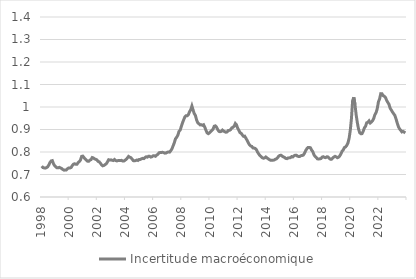
| Category | Incertitude macroéconomique |
|---|---|
| 1998-02-01 | 0.737 |
| 1998-03-01 | 0.731 |
| 1998-04-01 | 0.729 |
| 1998-05-01 | 0.728 |
| 1998-06-01 | 0.73 |
| 1998-07-01 | 0.734 |
| 1998-08-01 | 0.742 |
| 1998-09-01 | 0.753 |
| 1998-10-01 | 0.76 |
| 1998-11-01 | 0.762 |
| 1998-12-01 | 0.747 |
| 1999-01-01 | 0.739 |
| 1999-02-01 | 0.734 |
| 1999-03-01 | 0.73 |
| 1999-04-01 | 0.73 |
| 1999-05-01 | 0.732 |
| 1999-06-01 | 0.729 |
| 1999-07-01 | 0.726 |
| 1999-08-01 | 0.722 |
| 1999-09-01 | 0.719 |
| 1999-10-01 | 0.72 |
| 1999-11-01 | 0.72 |
| 1999-12-01 | 0.726 |
| 2000-01-01 | 0.729 |
| 2000-02-01 | 0.729 |
| 2000-03-01 | 0.731 |
| 2000-04-01 | 0.739 |
| 2000-05-01 | 0.746 |
| 2000-06-01 | 0.748 |
| 2000-07-01 | 0.746 |
| 2000-08-01 | 0.745 |
| 2000-09-01 | 0.753 |
| 2000-10-01 | 0.757 |
| 2000-11-01 | 0.764 |
| 2000-12-01 | 0.78 |
| 2001-01-01 | 0.782 |
| 2001-02-01 | 0.775 |
| 2001-03-01 | 0.769 |
| 2001-04-01 | 0.764 |
| 2001-05-01 | 0.759 |
| 2001-06-01 | 0.759 |
| 2001-07-01 | 0.764 |
| 2001-08-01 | 0.766 |
| 2001-09-01 | 0.775 |
| 2001-10-01 | 0.773 |
| 2001-11-01 | 0.769 |
| 2001-12-01 | 0.768 |
| 2002-01-01 | 0.765 |
| 2002-02-01 | 0.759 |
| 2002-03-01 | 0.756 |
| 2002-04-01 | 0.75 |
| 2002-05-01 | 0.742 |
| 2002-06-01 | 0.739 |
| 2002-07-01 | 0.74 |
| 2002-08-01 | 0.744 |
| 2002-09-01 | 0.748 |
| 2002-10-01 | 0.756 |
| 2002-11-01 | 0.766 |
| 2002-12-01 | 0.764 |
| 2003-01-01 | 0.765 |
| 2003-02-01 | 0.763 |
| 2003-03-01 | 0.762 |
| 2003-04-01 | 0.767 |
| 2003-05-01 | 0.762 |
| 2003-06-01 | 0.76 |
| 2003-07-01 | 0.762 |
| 2003-08-01 | 0.762 |
| 2003-09-01 | 0.762 |
| 2003-10-01 | 0.763 |
| 2003-11-01 | 0.76 |
| 2003-12-01 | 0.76 |
| 2004-01-01 | 0.763 |
| 2004-02-01 | 0.768 |
| 2004-03-01 | 0.774 |
| 2004-04-01 | 0.78 |
| 2004-05-01 | 0.777 |
| 2004-06-01 | 0.775 |
| 2004-07-01 | 0.769 |
| 2004-08-01 | 0.762 |
| 2004-09-01 | 0.761 |
| 2004-10-01 | 0.762 |
| 2004-11-01 | 0.764 |
| 2004-12-01 | 0.762 |
| 2005-01-01 | 0.767 |
| 2005-02-01 | 0.767 |
| 2005-03-01 | 0.77 |
| 2005-04-01 | 0.772 |
| 2005-05-01 | 0.771 |
| 2005-06-01 | 0.775 |
| 2005-07-01 | 0.779 |
| 2005-08-01 | 0.777 |
| 2005-09-01 | 0.781 |
| 2005-10-01 | 0.781 |
| 2005-11-01 | 0.777 |
| 2005-12-01 | 0.779 |
| 2006-01-01 | 0.783 |
| 2006-02-01 | 0.783 |
| 2006-03-01 | 0.781 |
| 2006-04-01 | 0.786 |
| 2006-05-01 | 0.79 |
| 2006-06-01 | 0.796 |
| 2006-07-01 | 0.798 |
| 2006-08-01 | 0.798 |
| 2006-09-01 | 0.799 |
| 2006-10-01 | 0.797 |
| 2006-11-01 | 0.795 |
| 2006-12-01 | 0.796 |
| 2007-01-01 | 0.799 |
| 2007-02-01 | 0.8 |
| 2007-03-01 | 0.799 |
| 2007-04-01 | 0.806 |
| 2007-05-01 | 0.814 |
| 2007-06-01 | 0.828 |
| 2007-07-01 | 0.841 |
| 2007-08-01 | 0.859 |
| 2007-09-01 | 0.865 |
| 2007-10-01 | 0.875 |
| 2007-11-01 | 0.892 |
| 2007-12-01 | 0.897 |
| 2008-01-01 | 0.914 |
| 2008-02-01 | 0.93 |
| 2008-03-01 | 0.943 |
| 2008-04-01 | 0.956 |
| 2008-05-01 | 0.961 |
| 2008-06-01 | 0.961 |
| 2008-07-01 | 0.966 |
| 2008-08-01 | 0.979 |
| 2008-09-01 | 0.988 |
| 2008-10-01 | 1.004 |
| 2008-11-01 | 0.987 |
| 2008-12-01 | 0.971 |
| 2009-01-01 | 0.962 |
| 2009-02-01 | 0.942 |
| 2009-03-01 | 0.93 |
| 2009-04-01 | 0.925 |
| 2009-05-01 | 0.92 |
| 2009-06-01 | 0.921 |
| 2009-07-01 | 0.918 |
| 2009-08-01 | 0.921 |
| 2009-09-01 | 0.91 |
| 2009-10-01 | 0.896 |
| 2009-11-01 | 0.885 |
| 2009-12-01 | 0.882 |
| 2010-01-01 | 0.885 |
| 2010-02-01 | 0.891 |
| 2010-03-01 | 0.896 |
| 2010-04-01 | 0.902 |
| 2010-05-01 | 0.914 |
| 2010-06-01 | 0.916 |
| 2010-07-01 | 0.911 |
| 2010-08-01 | 0.9 |
| 2010-09-01 | 0.892 |
| 2010-10-01 | 0.89 |
| 2010-11-01 | 0.892 |
| 2010-12-01 | 0.897 |
| 2011-01-01 | 0.893 |
| 2011-02-01 | 0.89 |
| 2011-03-01 | 0.888 |
| 2011-04-01 | 0.889 |
| 2011-05-01 | 0.896 |
| 2011-06-01 | 0.896 |
| 2011-07-01 | 0.9 |
| 2011-08-01 | 0.907 |
| 2011-09-01 | 0.91 |
| 2011-10-01 | 0.914 |
| 2011-11-01 | 0.927 |
| 2011-12-01 | 0.921 |
| 2012-01-01 | 0.906 |
| 2012-02-01 | 0.896 |
| 2012-03-01 | 0.886 |
| 2012-04-01 | 0.883 |
| 2012-05-01 | 0.876 |
| 2012-06-01 | 0.87 |
| 2012-07-01 | 0.87 |
| 2012-08-01 | 0.861 |
| 2012-09-01 | 0.852 |
| 2012-10-01 | 0.842 |
| 2012-11-01 | 0.832 |
| 2012-12-01 | 0.827 |
| 2013-01-01 | 0.825 |
| 2013-02-01 | 0.818 |
| 2013-03-01 | 0.817 |
| 2013-04-01 | 0.816 |
| 2013-05-01 | 0.81 |
| 2013-06-01 | 0.799 |
| 2013-07-01 | 0.791 |
| 2013-08-01 | 0.784 |
| 2013-09-01 | 0.779 |
| 2013-10-01 | 0.774 |
| 2013-11-01 | 0.772 |
| 2013-12-01 | 0.774 |
| 2014-01-01 | 0.778 |
| 2014-02-01 | 0.774 |
| 2014-03-01 | 0.77 |
| 2014-04-01 | 0.766 |
| 2014-05-01 | 0.764 |
| 2014-06-01 | 0.764 |
| 2014-07-01 | 0.764 |
| 2014-08-01 | 0.764 |
| 2014-09-01 | 0.767 |
| 2014-10-01 | 0.769 |
| 2014-11-01 | 0.774 |
| 2014-12-01 | 0.782 |
| 2015-01-01 | 0.785 |
| 2015-02-01 | 0.785 |
| 2015-03-01 | 0.782 |
| 2015-04-01 | 0.778 |
| 2015-05-01 | 0.776 |
| 2015-06-01 | 0.772 |
| 2015-07-01 | 0.77 |
| 2015-08-01 | 0.774 |
| 2015-09-01 | 0.774 |
| 2015-10-01 | 0.775 |
| 2015-11-01 | 0.78 |
| 2015-12-01 | 0.778 |
| 2016-01-01 | 0.783 |
| 2016-02-01 | 0.786 |
| 2016-03-01 | 0.786 |
| 2016-04-01 | 0.782 |
| 2016-05-01 | 0.78 |
| 2016-06-01 | 0.78 |
| 2016-07-01 | 0.784 |
| 2016-08-01 | 0.784 |
| 2016-09-01 | 0.787 |
| 2016-10-01 | 0.795 |
| 2016-11-01 | 0.806 |
| 2016-12-01 | 0.815 |
| 2017-01-01 | 0.82 |
| 2017-02-01 | 0.82 |
| 2017-03-01 | 0.819 |
| 2017-04-01 | 0.809 |
| 2017-05-01 | 0.802 |
| 2017-06-01 | 0.788 |
| 2017-07-01 | 0.78 |
| 2017-08-01 | 0.775 |
| 2017-09-01 | 0.77 |
| 2017-10-01 | 0.769 |
| 2017-11-01 | 0.77 |
| 2017-12-01 | 0.771 |
| 2018-01-01 | 0.777 |
| 2018-02-01 | 0.779 |
| 2018-03-01 | 0.776 |
| 2018-04-01 | 0.775 |
| 2018-05-01 | 0.779 |
| 2018-06-01 | 0.778 |
| 2018-07-01 | 0.773 |
| 2018-08-01 | 0.768 |
| 2018-09-01 | 0.768 |
| 2018-10-01 | 0.773 |
| 2018-11-01 | 0.778 |
| 2018-12-01 | 0.781 |
| 2019-01-01 | 0.779 |
| 2019-02-01 | 0.775 |
| 2019-03-01 | 0.777 |
| 2019-04-01 | 0.782 |
| 2019-05-01 | 0.791 |
| 2019-06-01 | 0.803 |
| 2019-07-01 | 0.809 |
| 2019-08-01 | 0.82 |
| 2019-09-01 | 0.823 |
| 2019-10-01 | 0.829 |
| 2019-11-01 | 0.84 |
| 2019-12-01 | 0.861 |
| 2020-01-01 | 0.896 |
| 2020-02-01 | 0.949 |
| 2020-03-01 | 1.028 |
| 2020-04-01 | 1.043 |
| 2020-05-01 | 1.011 |
| 2020-06-01 | 0.965 |
| 2020-07-01 | 0.931 |
| 2020-08-01 | 0.903 |
| 2020-09-01 | 0.886 |
| 2020-10-01 | 0.881 |
| 2020-11-01 | 0.882 |
| 2020-12-01 | 0.892 |
| 2021-01-01 | 0.907 |
| 2021-02-01 | 0.914 |
| 2021-03-01 | 0.93 |
| 2021-04-01 | 0.932 |
| 2021-05-01 | 0.938 |
| 2021-06-01 | 0.929 |
| 2021-07-01 | 0.933 |
| 2021-08-01 | 0.939 |
| 2021-09-01 | 0.95 |
| 2021-10-01 | 0.966 |
| 2021-11-01 | 0.975 |
| 2021-12-01 | 0.993 |
| 2022-01-01 | 1.023 |
| 2022-02-01 | 1.036 |
| 2022-03-01 | 1.059 |
| 2022-04-01 | 1.059 |
| 2022-05-01 | 1.05 |
| 2022-06-01 | 1.048 |
| 2022-07-01 | 1.043 |
| 2022-08-01 | 1.029 |
| 2022-09-01 | 1.02 |
| 2022-10-01 | 1.012 |
| 2022-11-01 | 0.994 |
| 2022-12-01 | 0.986 |
| 2023-01-01 | 0.977 |
| 2023-02-01 | 0.97 |
| 2023-03-01 | 0.963 |
| 2023-04-01 | 0.947 |
| 2023-05-01 | 0.929 |
| 2023-06-01 | 0.913 |
| 2023-07-01 | 0.903 |
| 2023-08-01 | 0.896 |
| 2023-09-01 | 0.889 |
| 2023-10-01 | 0.892 |
| 2023-11-01 | 0.888 |
| 2023-12-01 | 0.885 |